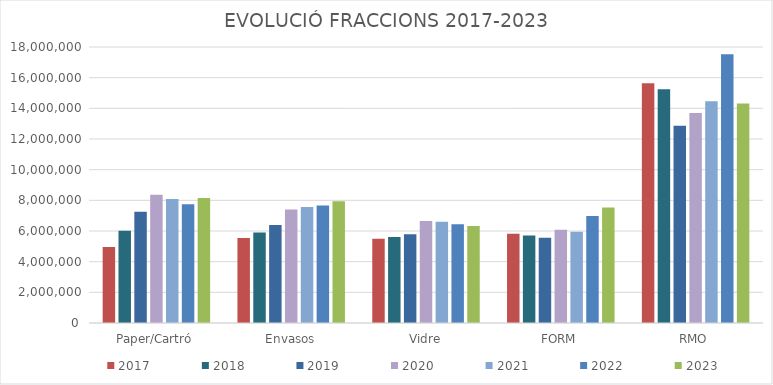
| Category | 2017 | 2018 | 2019 | 2020 | 2021 | 2022 | 2023 |
|---|---|---|---|---|---|---|---|
| Paper/Cartró | 4953910.06 | 6017219.86 | 7250915.57 | 8372094.29 | 8090302.45 | 7739103.219 | 8150056.627 |
| Envasos | 5549519.375 | 5899329.437 | 6396876.398 | 7402776.01 | 7561088.526 | 7655482.234 | 7935282.071 |
| Vidre | 5486423.152 | 5606946.03 | 5795567.37 | 6653404.84 | 6597864.4 | 6437843.599 | 6323008.919 |
| FORM | 5812523.86 | 5709720.03 | 5559130.04 | 6073854.03 | 5947509.98 | 6982359.01 | 7537759.99 |
| RMO | 15636729 | 15240978 | 12866677.82 | 13694820.1 | 14469238.01 | 17530549 | 14309430 |